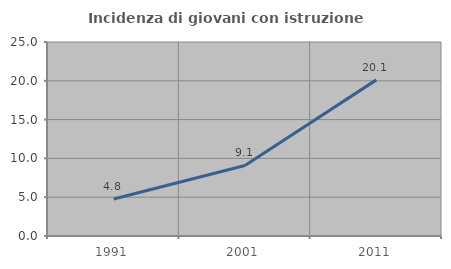
| Category | Incidenza di giovani con istruzione universitaria |
|---|---|
| 1991.0 | 4.762 |
| 2001.0 | 9.091 |
| 2011.0 | 20.118 |